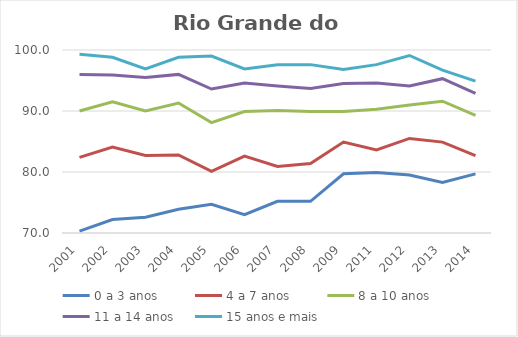
| Category | 0 a 3 anos | 4 a 7 anos | 8 a 10 anos | 11 a 14 anos | 15 anos e mais |
|---|---|---|---|---|---|
| 2001.0 | 70.3 | 82.4 | 90 | 96 | 99.3 |
| 2002.0 | 72.2 | 84.1 | 91.5 | 95.9 | 98.8 |
| 2003.0 | 72.6 | 82.7 | 90 | 95.5 | 96.9 |
| 2004.0 | 73.9 | 82.8 | 91.3 | 96 | 98.8 |
| 2005.0 | 74.7 | 80.1 | 88.1 | 93.6 | 99 |
| 2006.0 | 73 | 82.6 | 89.9 | 94.6 | 96.9 |
| 2007.0 | 75.2 | 80.9 | 90.1 | 94.1 | 97.6 |
| 2008.0 | 75.2 | 81.4 | 89.9 | 93.7 | 97.6 |
| 2009.0 | 79.7 | 84.9 | 89.9 | 94.5 | 96.8 |
| 2011.0 | 79.9 | 83.6 | 90.3 | 94.6 | 97.6 |
| 2012.0 | 79.5 | 85.5 | 91 | 94.1 | 99.1 |
| 2013.0 | 78.3 | 84.9 | 91.6 | 95.3 | 96.7 |
| 2014.0 | 79.7 | 82.7 | 89.3 | 92.9 | 94.9 |